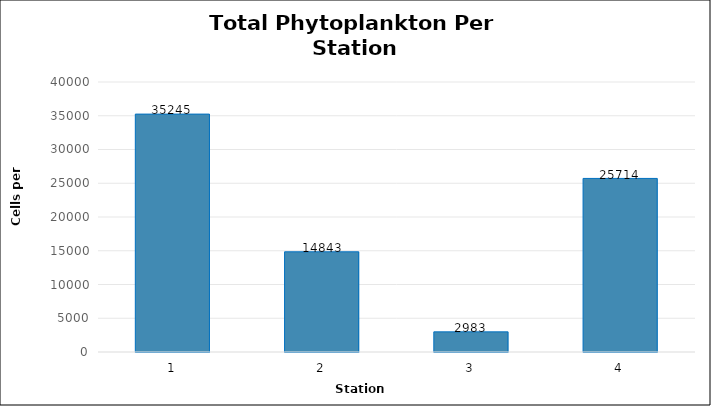
| Category | Count |
|---|---|
| 1.0 | 35245 |
| 2.0 | 14843 |
| 3.0 | 2983 |
| 4.0 | 25714 |